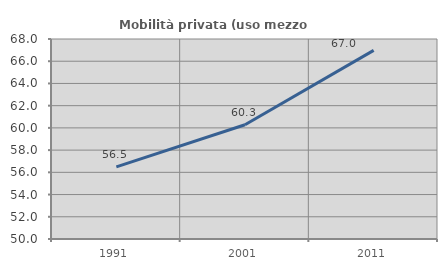
| Category | Mobilità privata (uso mezzo privato) |
|---|---|
| 1991.0 | 56.486 |
| 2001.0 | 60.286 |
| 2011.0 | 66.979 |